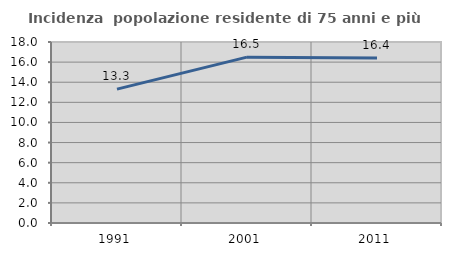
| Category | Incidenza  popolazione residente di 75 anni e più |
|---|---|
| 1991.0 | 13.31 |
| 2001.0 | 16.494 |
| 2011.0 | 16.42 |